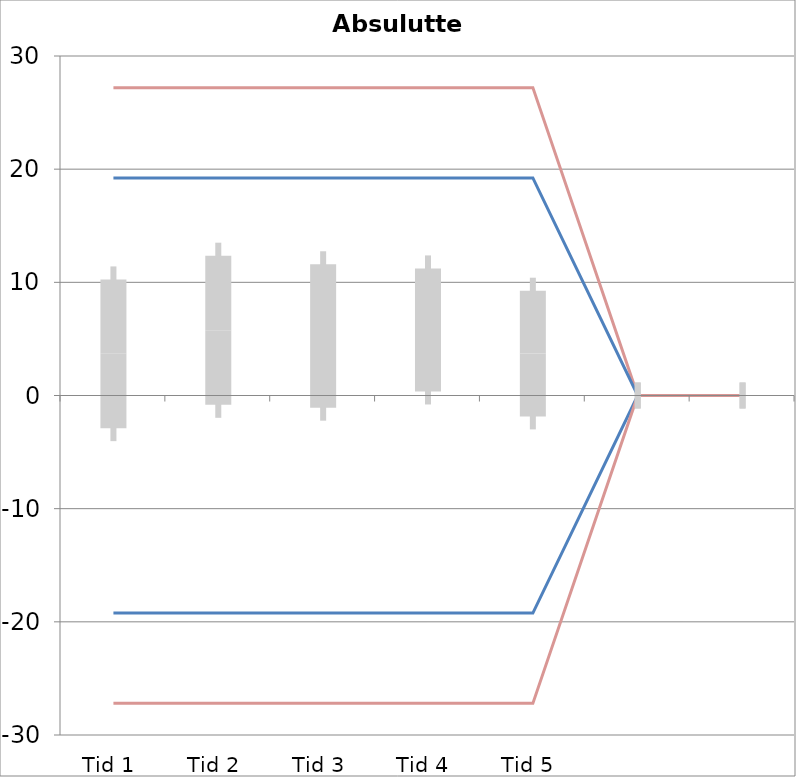
| Category | 1 | 2 | 3 | 4 | 5 | 6 | 7 | 8 | 9 | 10 | 11 | 12 | 13 | 14 | 15 | 16 | 17 | 18 | 19 | 20 | TEa | B | -B | -TEa | M |
|---|---|---|---|---|---|---|---|---|---|---|---|---|---|---|---|---|---|---|---|---|---|---|---|---|---|
| Tid 1 | 19.36 | 7.2 | 0.59 | 18.21 | -10.12 | -4.11 | 3.59 | -0.58 | 1.76 | 0.97 | 0 | 0 | 0 | 0 | 0 | 0 | 0 | 0 | 0 | 0 | 27.205 | 19.226 | -19.226 | -27.205 | 3.687 |
| Tid 2 | 20.94 | 5.82 | 0.69 | 23.4 | -5.53 | 1.94 | 4.89 | 2.07 | 3.61 | -0.17 | 0 | 0 | 0 | 0 | 0 | 0 | 0 | 0 | 0 | 0 | 27.205 | 19.226 | -19.226 | -27.205 | 5.766 |
| Tid 3 | 23.11 | 7.88 | 0.89 | 0 | -5.22 | 7.13 | 10.38 | -1.01 | 2 | 2.18 | 0 | 0 | 0 | 0 | 0 | 0 | 0 | 0 | 0 | 0 | 27.205 | 19.226 | -19.226 | -27.205 | 5.26 |
| Tid 4 | 23.76 | 7.37 | 1.09 | 0 | 1.41 | 3.86 | 6.21 | 4.08 | 2.67 | 1.68 | 0 | 0 | 0 | 0 | 0 | 0 | 0 | 0 | 0 | 0 | 27.205 | 19.226 | -19.226 | -27.205 | 5.792 |
| Tid 5 | 15.36 | 7.02 | 0.89 | 0 | -5.43 | -4.19 | 13.9 | 2.95 | 2.43 | 0.43 | 0 | 0 | 0 | 0 | 0 | 0 | 0 | 0 | 0 | 0 | 27.205 | 19.226 | -19.226 | -27.205 | 3.707 |